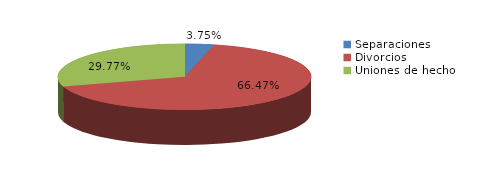
| Category | Series 0 |
|---|---|
| Separaciones | 45 |
| Divorcios | 797 |
| Uniones de hecho | 357 |